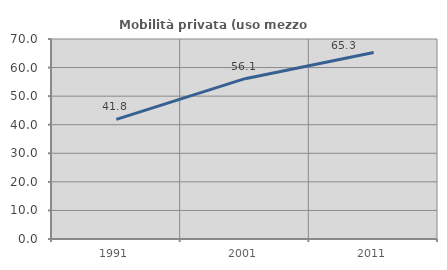
| Category | Mobilità privata (uso mezzo privato) |
|---|---|
| 1991.0 | 41.85 |
| 2001.0 | 56.115 |
| 2011.0 | 65.269 |